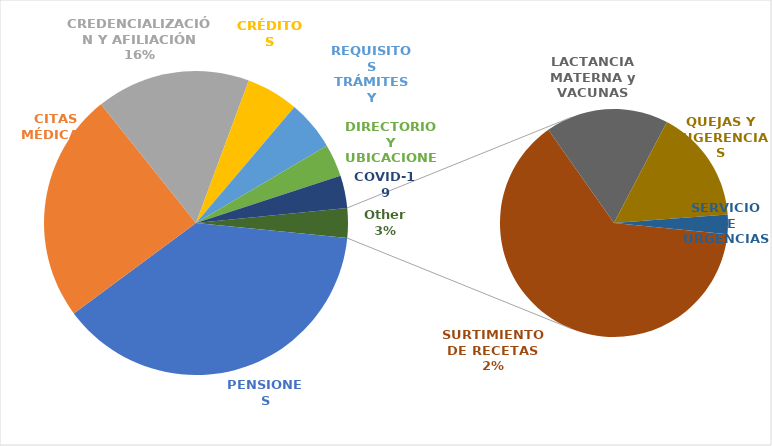
| Category |  TOTAL  |
|---|---|
| PENSIONES | 9964 |
| CITAS MÉDICAS | 6350 |
| CREDENCIALIZACIÓN Y AFILIACIÓN | 4267 |
| CRÉDITOS | 1445 |
| REQUISITOS TRÁMITES Y SERVICIOS | 1380 |
| DIRECTORIO Y UBICACIONES | 906 |
| COVID-19 | 894 |
| SURTIMIENTO DE RECETAS | 525 |
| LACTANCIA MATERNA y VACUNAS | 144 |
| QUEJAS Y SUGERENCIAS | 133 |
| SERVICIO DE URGENCIAS | 23 |